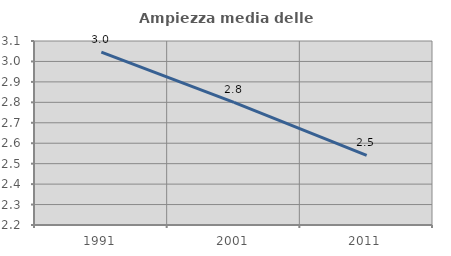
| Category | Ampiezza media delle famiglie |
|---|---|
| 1991.0 | 3.045 |
| 2001.0 | 2.8 |
| 2011.0 | 2.54 |